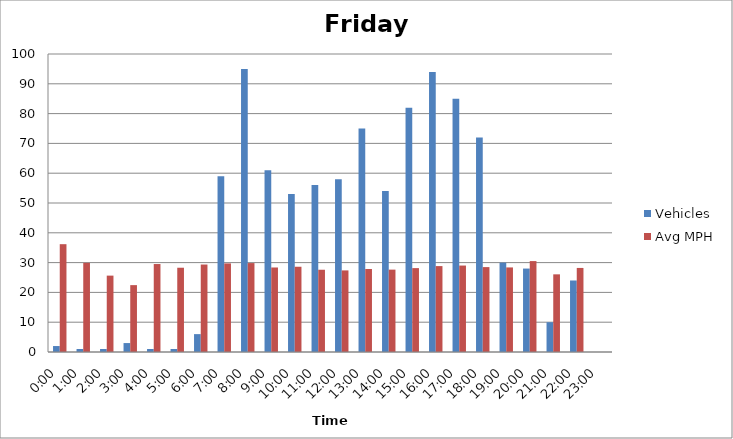
| Category | Vehicles | Avg MPH |
|---|---|---|
| 0:00 | 2 | 36.18 |
| 1:00 | 1 | 29.92 |
| 2:00 | 1 | 25.63 |
| 3:00 | 3 | 22.44 |
| 4:00 | 1 | 29.52 |
| 5:00 | 1 | 28.28 |
| 6:00 | 6 | 29.35 |
| 7:00 | 59 | 29.73 |
| 8:00 | 95 | 29.84 |
| 9:00 | 61 | 28.36 |
| 10:00 | 53 | 28.61 |
| 11:00 | 56 | 27.6 |
| 12:00 | 58 | 27.38 |
| 13:00 | 75 | 27.86 |
| 14:00 | 54 | 27.64 |
| 15:00 | 82 | 28.15 |
| 16:00 | 94 | 28.83 |
| 17:00 | 85 | 29.01 |
| 18:00 | 72 | 28.49 |
| 19:00 | 30 | 28.38 |
| 20:00 | 28 | 30.51 |
| 21:00 | 10 | 26.06 |
| 22:00 | 24 | 28.21 |
| 23:00 | 0 | 0 |